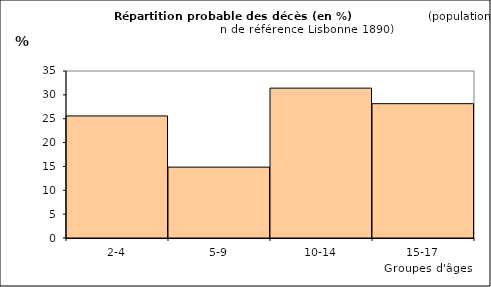
| Category | Series 0 |
|---|---|
| 2-4 | 25.582 |
| 5-9 | 14.857 |
| 10-14 | 31.41 |
| 15-17 | 28.15 |